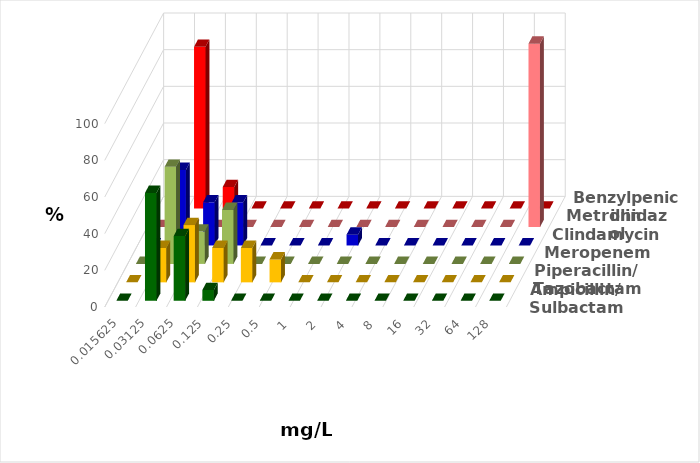
| Category | Ampicillin/ Sulbactam | Piperacillin/ Tazobactam | Meropenem | Clindamycin | Metronidazol | Benzylpenicillin |
|---|---|---|---|---|---|---|
| 0.015625 | 0 | 0 | 0 | 0 | 0 | 0 |
| 0.03125 | 58.824 | 18.75 | 52.941 | 41.176 | 0 | 88.235 |
| 0.0625 | 35.294 | 31.25 | 17.647 | 23.529 | 0 | 11.765 |
| 0.125 | 5.882 | 18.75 | 29.412 | 23.529 | 0 | 0 |
| 0.25 | 0 | 18.75 | 0 | 0 | 0 | 0 |
| 0.5 | 0 | 12.5 | 0 | 0 | 0 | 0 |
| 1.0 | 0 | 0 | 0 | 0 | 0 | 0 |
| 2.0 | 0 | 0 | 0 | 5.882 | 0 | 0 |
| 4.0 | 0 | 0 | 0 | 0 | 0 | 0 |
| 8.0 | 0 | 0 | 0 | 0 | 0 | 0 |
| 16.0 | 0 | 0 | 0 | 0 | 0 | 0 |
| 32.0 | 0 | 0 | 0 | 0 | 0 | 0 |
| 64.0 | 0 | 0 | 0 | 0 | 0 | 0 |
| 128.0 | 0 | 0 | 0 | 0 | 100 | 0 |